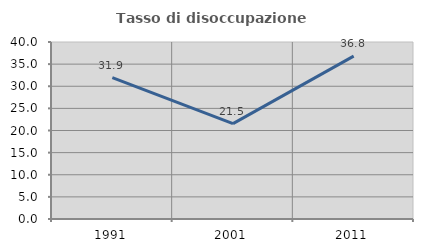
| Category | Tasso di disoccupazione giovanile  |
|---|---|
| 1991.0 | 31.943 |
| 2001.0 | 21.545 |
| 2011.0 | 36.812 |